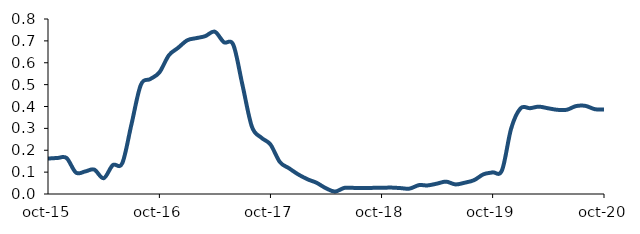
| Category | Series 0 |
|---|---|
| 2015-10-01 | 0.162 |
| 2015-11-01 | 0.165 |
| 2015-12-01 | 0.164 |
| 2016-01-01 | 0.098 |
| 2016-02-01 | 0.103 |
| 2016-03-01 | 0.112 |
| 2016-04-01 | 0.072 |
| 2016-05-01 | 0.132 |
| 2016-06-01 | 0.141 |
| 2016-07-01 | 0.317 |
| 2016-08-01 | 0.499 |
| 2016-09-01 | 0.525 |
| 2016-10-01 | 0.556 |
| 2016-11-01 | 0.634 |
| 2016-12-01 | 0.668 |
| 2017-01-01 | 0.703 |
| 2017-02-01 | 0.713 |
| 2017-03-01 | 0.722 |
| 2017-04-01 | 0.742 |
| 2017-05-01 | 0.694 |
| 2017-06-01 | 0.682 |
| 2017-07-01 | 0.498 |
| 2017-08-01 | 0.308 |
| 2017-09-01 | 0.257 |
| 2017-10-01 | 0.226 |
| 2017-11-01 | 0.146 |
| 2017-12-01 | 0.118 |
| 2018-01-01 | 0.089 |
| 2018-02-01 | 0.067 |
| 2018-03-01 | 0.052 |
| 2018-04-01 | 0.026 |
| 2018-05-01 | 0.011 |
| 2018-06-01 | 0.028 |
| 2018-07-01 | 0.028 |
| 2018-08-01 | 0.028 |
| 2018-09-01 | 0.028 |
| 2018-10-01 | 0.028 |
| 2018-11-01 | 0.029 |
| 2018-12-01 | 0.027 |
| 2019-01-01 | 0.025 |
| 2019-02-01 | 0.041 |
| 2019-03-01 | 0.039 |
| 2019-04-01 | 0.047 |
| 2019-05-01 | 0.056 |
| 2019-06-01 | 0.044 |
| 2019-07-01 | 0.052 |
| 2019-08-01 | 0.063 |
| 2019-09-01 | 0.09 |
| 2019-10-01 | 0.099 |
| 2019-11-01 | 0.109 |
| 2019-12-01 | 0.3 |
| 2020-01-01 | 0.392 |
| 2020-02-01 | 0.392 |
| 2020-03-01 | 0.399 |
| 2020-04-01 | 0.392 |
| 2020-05-01 | 0.385 |
| 2020-06-01 | 0.385 |
| 2020-07-01 | 0.402 |
| 2020-08-01 | 0.403 |
| 2020-09-01 | 0.388 |
| 2020-10-01 | 0.387 |